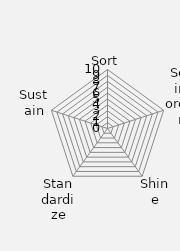
| Category | Series 0 |
|---|---|
| Sort | 0 |
| Set in order | 0 |
| Shine | 0 |
| Standardize | 0 |
| Sustain | 0 |